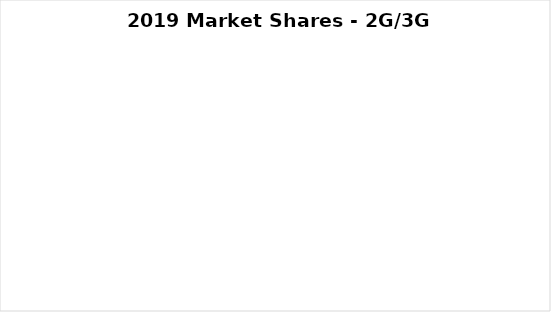
| Category | 2019 |
|---|---|
| Ericsson | 0 |
| Fujitsu | 0 |
| HPE | 0 |
| Huawei | 0 |
| Nokia | 0 |
| Samsung | 0 |
| ZTE | 0 |
| Other | 0 |